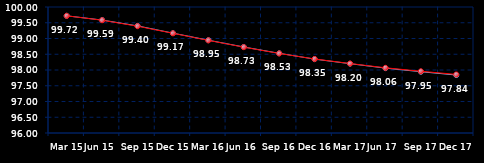
| Category | Series 0 | Series 1 |
|---|---|---|
| Mar 15 | 99.72 | 99.72 |
| Jun 15 | 99.585 | 99.58 |
| Sep 15 | 99.4 | 99.39 |
| Dec 15 | 99.17 | 99.165 |
| Mar 16 | 98.945 | 98.94 |
| Jun 16 | 98.73 | 98.725 |
| Sep 16 | 98.53 | 98.525 |
| Dec 16 | 98.345 | 98.35 |
| Mar 17 | 98.2 | 98.205 |
| Jun 17 | 98.06 | 98.07 |
| Sep 17 | 97.945 | 97.96 |
| Dec 17 | 97.84 | 97.86 |